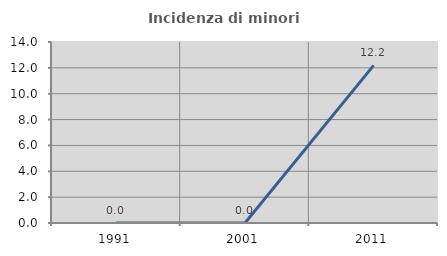
| Category | Incidenza di minori stranieri |
|---|---|
| 1991.0 | 0 |
| 2001.0 | 0 |
| 2011.0 | 12.195 |